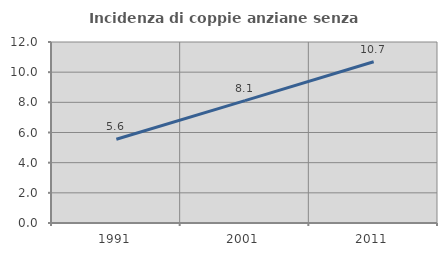
| Category | Incidenza di coppie anziane senza figli  |
|---|---|
| 1991.0 | 5.556 |
| 2001.0 | 8.111 |
| 2011.0 | 10.688 |